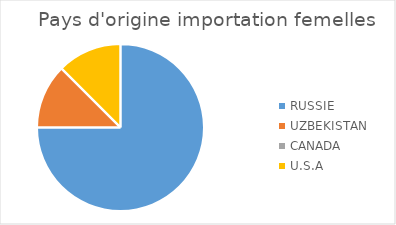
| Category | Series 0 |
|---|---|
| RUSSIE | 6 |
| UZBEKISTAN | 1 |
| CANADA | 0 |
| U.S.A | 1 |